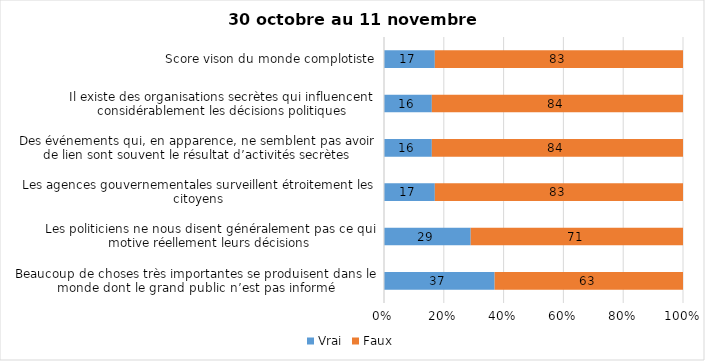
| Category | Vrai | Faux |
|---|---|---|
| Beaucoup de choses très importantes se produisent dans le monde dont le grand public n’est pas informé | 37 | 63 |
| Les politiciens ne nous disent généralement pas ce qui motive réellement leurs décisions | 29 | 71 |
| Les agences gouvernementales surveillent étroitement les citoyens | 17 | 83 |
| Des événements qui, en apparence, ne semblent pas avoir de lien sont souvent le résultat d’activités secrètes | 16 | 84 |
| Il existe des organisations secrètes qui influencent considérablement les décisions politiques | 16 | 84 |
| Score vison du monde complotiste | 17 | 83 |